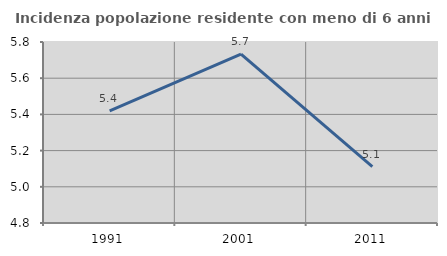
| Category | Incidenza popolazione residente con meno di 6 anni |
|---|---|
| 1991.0 | 5.42 |
| 2001.0 | 5.733 |
| 2011.0 | 5.111 |